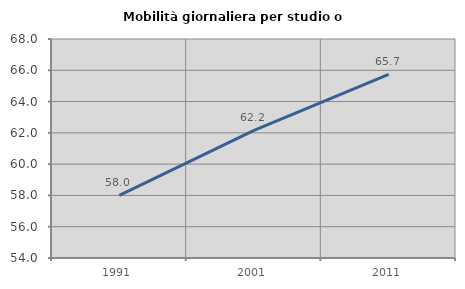
| Category | Mobilità giornaliera per studio o lavoro |
|---|---|
| 1991.0 | 57.998 |
| 2001.0 | 62.153 |
| 2011.0 | 65.732 |